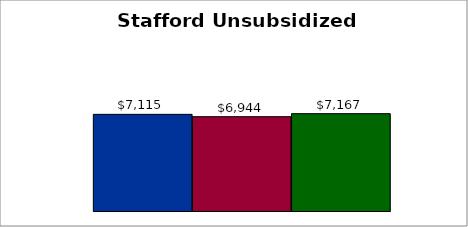
| Category | 50 states and D.C. | SREB states | State |
|---|---|---|---|
| 0 | 7114.895 | 6944.21 | 7167.229 |